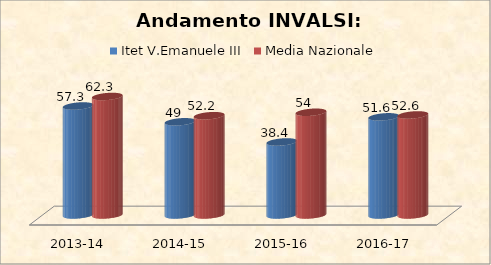
| Category | Itet V.Emanuele III | Media Nazionale |
|---|---|---|
| 2013-14 | 57.3 | 62.3 |
| 2014-15 | 49 | 52.2 |
| 2015-16 | 38.4 | 54 |
| 2016-17 | 51.6 | 52.6 |